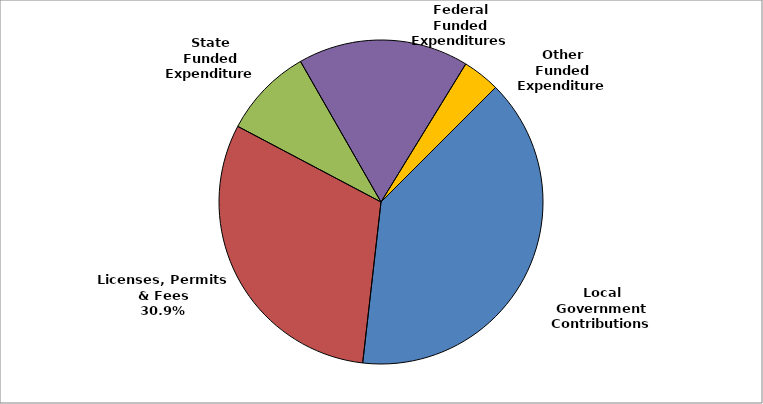
| Category | Series 0 |
|---|---|
| Local Government Contributions | 0.393 |
| Licenses, Permits & Fees | 0.309 |
| State Funded Expenditures | 0.09 |
| Federal Funded Expenditures | 0.17 |
| Other Funded Expenditures | 0.037 |